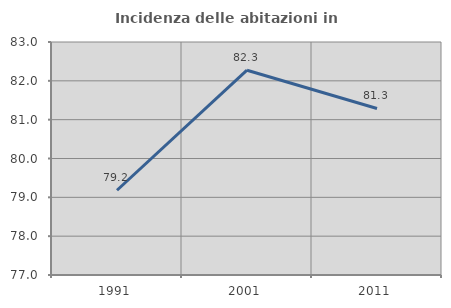
| Category | Incidenza delle abitazioni in proprietà  |
|---|---|
| 1991.0 | 79.183 |
| 2001.0 | 82.273 |
| 2011.0 | 81.288 |